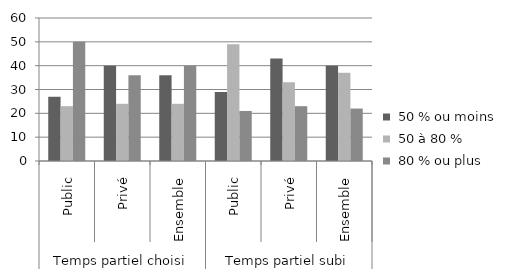
| Category |  50 % ou moins |  50 à 80 % |  80 % ou plus |
|---|---|---|---|
| 0 | 27 | 23 | 50 |
| 1 | 40 | 24 | 36 |
| 2 | 36 | 24 | 40 |
| 3 | 29 | 49 | 21 |
| 4 | 43 | 33 | 23 |
| 5 | 40 | 37 | 22 |